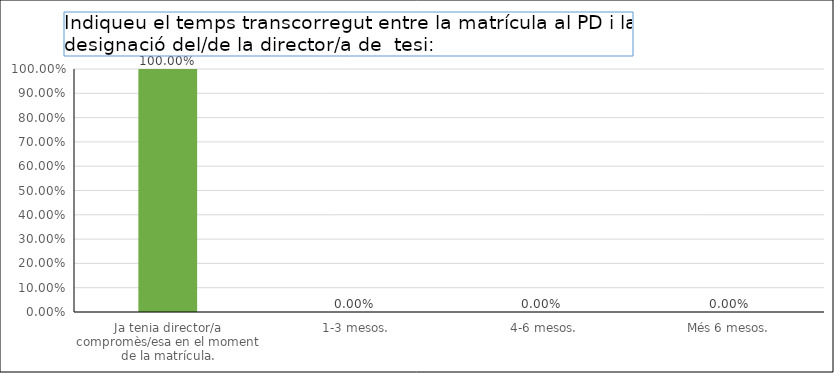
| Category | Series 0 |
|---|---|
| Ja tenia director/a compromès/esa en el moment de la matrícula. | 1 |
|  1-3 mesos. | 0 |
|  4-6 mesos. | 0 |
| Més 6 mesos. | 0 |